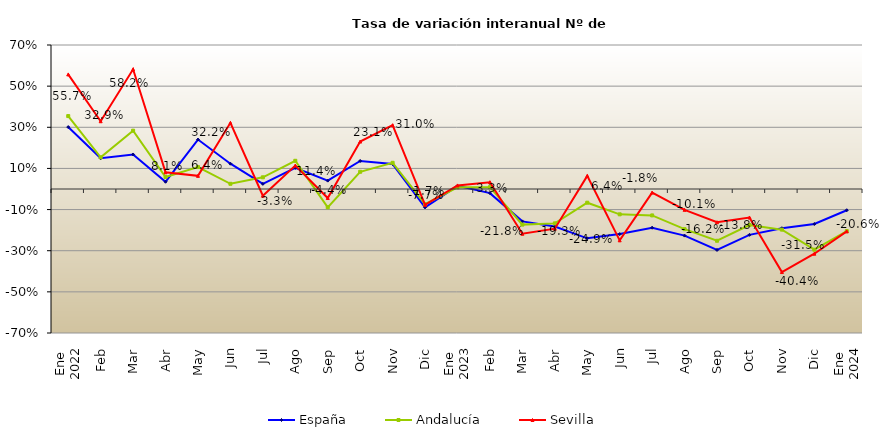
| Category | España | Andalucía | Sevilla |
|---|---|---|---|
| 0 | 0.301 | 0.354 | 0.557 |
| 1 | 0.149 | 0.154 | 0.329 |
| 2 | 0.168 | 0.284 | 0.582 |
| 3 | 0.035 | 0.058 | 0.081 |
| 4 | 0.24 | 0.107 | 0.064 |
| 5 | 0.123 | 0.025 | 0.322 |
| 6 | 0.025 | 0.057 | -0.033 |
| 7 | 0.102 | 0.137 | 0.114 |
| 8 | 0.041 | -0.089 | -0.044 |
| 9 | 0.136 | 0.084 | 0.231 |
| 10 | 0.121 | 0.127 | 0.31 |
| 11 | -0.089 | -0.074 | -0.077 |
| 12 | 0.015 | 0.008 | 0.017 |
| 13 | -0.02 | 0.009 | 0.033 |
| 14 | -0.157 | -0.173 | -0.218 |
| 15 | -0.183 | -0.167 | -0.193 |
| 16 | -0.24 | -0.067 | 0.064 |
| 17 | -0.219 | -0.123 | -0.249 |
| 18 | -0.188 | -0.128 | -0.018 |
| 19 | -0.227 | -0.195 | -0.101 |
| 20 | -0.296 | -0.252 | -0.162 |
| 21 | -0.223 | -0.175 | -0.138 |
| 22 | -0.191 | -0.198 | -0.404 |
| 23 | -0.17 | -0.295 | -0.315 |
| 24 | -0.103 | -0.205 | -0.206 |